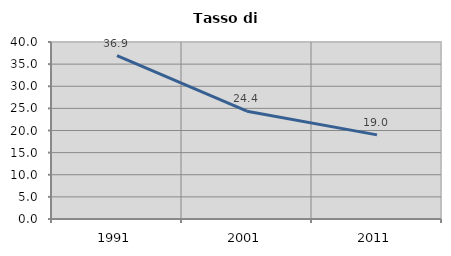
| Category | Tasso di disoccupazione   |
|---|---|
| 1991.0 | 36.907 |
| 2001.0 | 24.363 |
| 2011.0 | 19.01 |